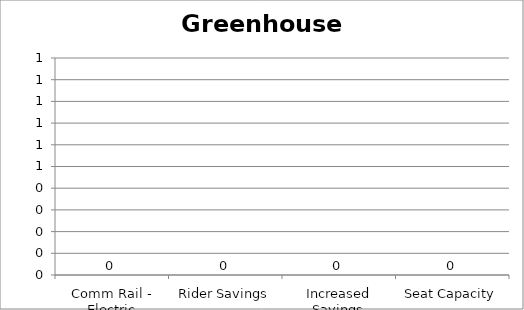
| Category | Greenhouse Gas |
|---|---|
| Comm Rail - Electric | 0 |
| Rider Savings | 0 |
| Increased Savings | 0 |
| Seat Capacity | 0 |